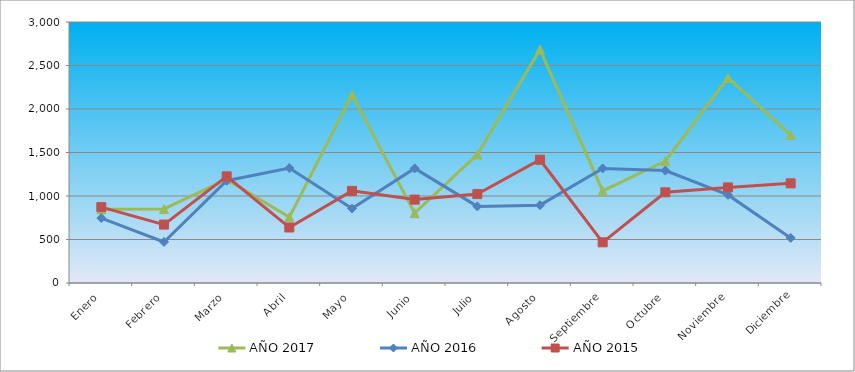
| Category | AÑO 2017 | AÑO 2016 | AÑO 2015 |
|---|---|---|---|
| Enero | 848.016 | 745.963 | 871.813 |
| Febrero | 851.785 | 471.663 | 671.396 |
| Marzo | 1190.991 | 1175.318 | 1225.882 |
| Abril | 757.561 | 1320.901 | 637.993 |
| Mayo | 2163.382 | 855.745 | 1058.868 |
| Junio | 802.788 | 1317.35 | 958.66 |
| Julio | 1477.432 | 880.601 | 1022.125 |
| Agosto | 2683.498 | 894.804 | 1416.278 |
| Septiembre | 1059.077 | 1317.35 | 467.639 |
| Octubre | 1402.053 | 1292.495 | 1042.167 |
| Noviembre | 2359.368 | 1011.981 | 1098.952 |
| Diciembre | 1699.8 | 518.418 | 1145.716 |